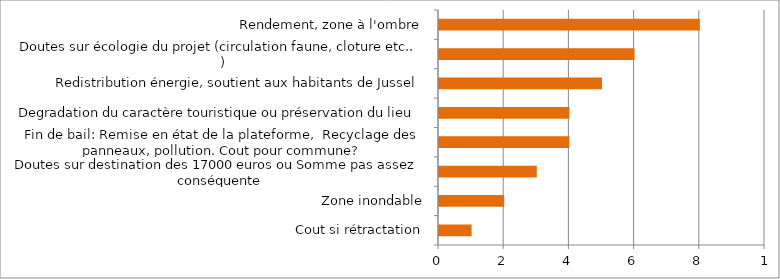
| Category | Series 0 |
|---|---|
| Cout si rétractation | 1 |
| Zone inondable | 2 |
| Doutes sur destination des 17000 euros ou Somme pas assez conséquente | 3 |
| Fin de bail: Remise en état de la plateforme,  Recyclage des panneaux, pollution. Cout pour commune? | 4 |
| Degradation du caractère touristique ou préservation du lieu | 4 |
| Redistribution énergie, soutient aux habitants de Jussel | 5 |
| Doutes sur écologie du projet (circulation faune, cloture etc.. ) | 6 |
| Rendement, zone à l'ombre | 8 |